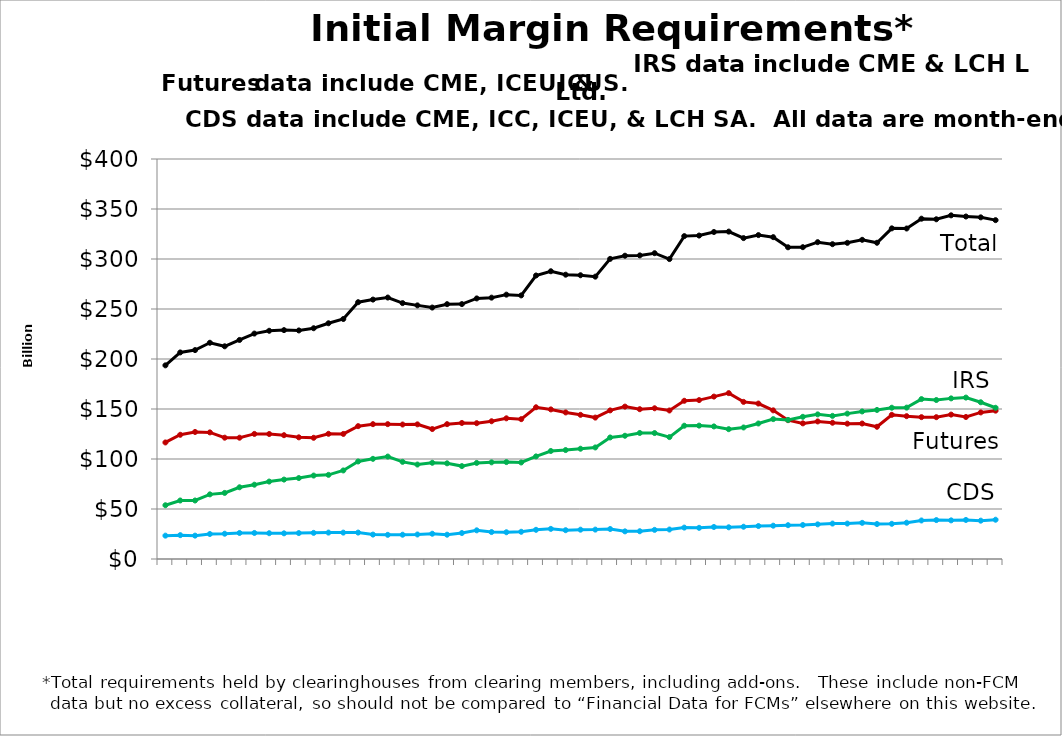
| Category | CDS | Futures | IRS | Total |
|---|---|---|---|---|
| nan |  |  |  |  |
| 2014-02-28 |  |  |  |  |
| nan |  |  |  |  |
| 2014-04-30 |  |  |  |  |
| nan |  |  |  |  |
| 2014-06-30 |  |  |  |  |
| nan |  |  |  |  |
| 2014-08-29 |  |  |  |  |
| nan |  |  |  |  |
| 2014-10-31 |  |  |  |  |
| nan |  |  |  |  |
| 2014-12-31 |  |  |  |  |
| nan |  |  |  |  |
| 2015-02-27 |  |  |  |  |
| nan |  |  |  |  |
| 2015-04-30 |  |  |  |  |
| nan |  |  |  |  |
| 2015-06-30 |  |  |  |  |
| nan |  |  |  |  |
| 2015-08-31 |  |  |  |  |
| nan |  |  |  |  |
| 2015-10-30 |  |  |  |  |
| nan |  |  |  |  |
| 2015-12-31 |  |  |  |  |
| nan |  |  |  |  |
| 2016-02-29 |  |  |  |  |
| nan |  |  |  |  |
| 2016-04-29 |  |  |  |  |
| nan |  |  |  |  |
| 2016-06-30 |  |  |  |  |
| nan |  |  |  |  |
| 2016-08-31 |  |  |  |  |
| nan |  |  |  |  |
| 2016-10-31 |  |  |  |  |
| nan |  |  |  |  |
| 2016-12-30 |  |  |  |  |
| nan |  |  |  |  |
| 2017-02-28 |  |  |  |  |
| nan |  |  |  |  |
| 2017-04-28 |  |  |  |  |
| nan |  |  |  |  |
| 2017-06-30 |  |  |  |  |
| nan |  |  |  |  |
| 2017-08-31 |  |  |  |  |
| nan |  |  |  |  |
| 2017-10-31 |  |  |  |  |
| nan |  |  |  |  |
| 2017-12-29 |  |  |  |  |
| nan |  |  |  |  |
| 2018-02-28 |  |  |  |  |
| nan |  |  |  |  |
| 2018-04-30 |  |  |  |  |
| nan |  |  |  |  |
| 2018-06-29 |  |  |  |  |
| nan |  |  |  |  |
| 2018-08-31 |  |  |  |  |